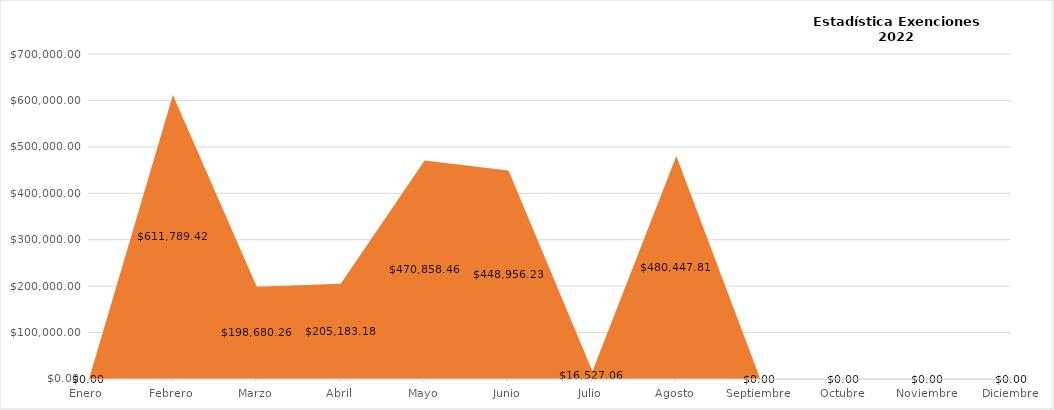
| Category | Total de Monto Condonado |
|---|---|
| Enero  | 0 |
| Febrero | 611789.42 |
| Marzo | 198680.26 |
| Abril | 205183.18 |
| Mayo | 470858.46 |
| Junio | 448956.23 |
| Julio | 16527.06 |
| Agosto | 480447.81 |
| Septiembre | 0 |
| Octubre | 0 |
| Noviembre | 0 |
| Diciembre | 0 |